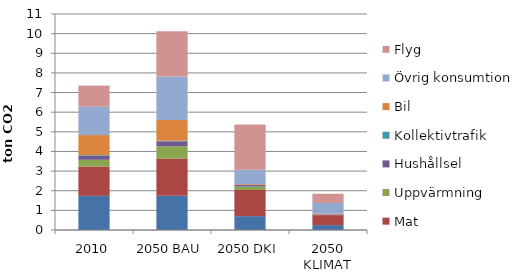
| Category | Offentlig konsumtion | Mat | Uppvärmning | Hushållsel | Kollektivtrafik | Bil | Övrig konsumtion | Flyg |
|---|---|---|---|---|---|---|---|---|
| 2010 | 1.74 | 1.494 | 0.342 | 0.207 | 0.032 | 1.02 | 1.443 | 1.075 |
| 2050 BAU | 1.74 | 1.901 | 0.62 | 0.258 | 0.027 | 1.053 | 2.219 | 2.303 |
| 2050 DKI | 0.705 | 1.331 | 0.173 | 0.08 | 0.006 | 0.039 | 0.739 | 2.303 |
| 2050 KLIMAT | 0.25 | 0.507 | 0.002 | 0.036 | 0.003 | 0.031 | 0.547 | 0.47 |